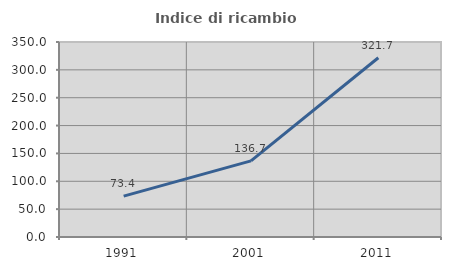
| Category | Indice di ricambio occupazionale  |
|---|---|
| 1991.0 | 73.373 |
| 2001.0 | 136.701 |
| 2011.0 | 321.72 |